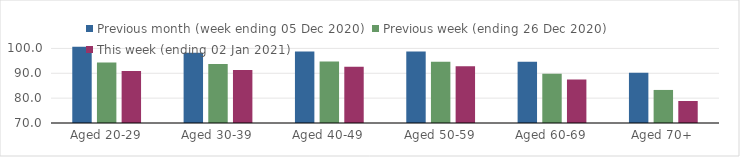
| Category | Previous month (week ending 05 Dec 2020) | Previous week (ending 26 Dec 2020) | This week (ending 02 Jan 2021) |
|---|---|---|---|
| Aged 20-29 | 100.69 | 94.31 | 90.95 |
| Aged 30-39 | 98.25 | 93.73 | 91.34 |
| Aged 40-49 | 98.76 | 94.71 | 92.63 |
| Aged 50-59 | 98.74 | 94.67 | 92.79 |
| Aged 60-69 | 94.68 | 89.82 | 87.46 |
| Aged 70+ | 90.18 | 83.3 | 78.86 |